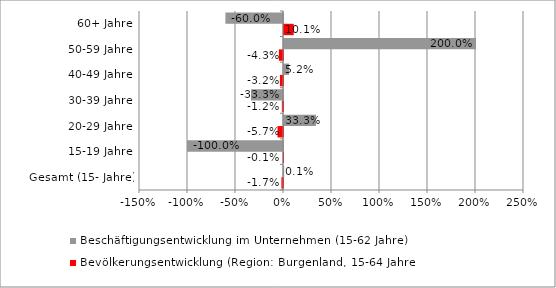
| Category | Bevölkerungsentwicklung (Region: Burgenland, 15-64 Jahre) | Beschäftigungsentwicklung im Unternehmen (15-62 Jahre) |
|---|---|---|
| Gesamt (15- Jahre) | -0.017 | 0.001 |
| 15-19 Jahre | -0.001 | -1 |
| 20-29 Jahre | -0.057 | 0.333 |
| 30-39 Jahre | -0.012 | -0.333 |
| 40-49 Jahre | -0.032 | 0.052 |
| 50-59 Jahre | -0.043 | 2 |
| 60+ Jahre | 0.101 | -0.6 |